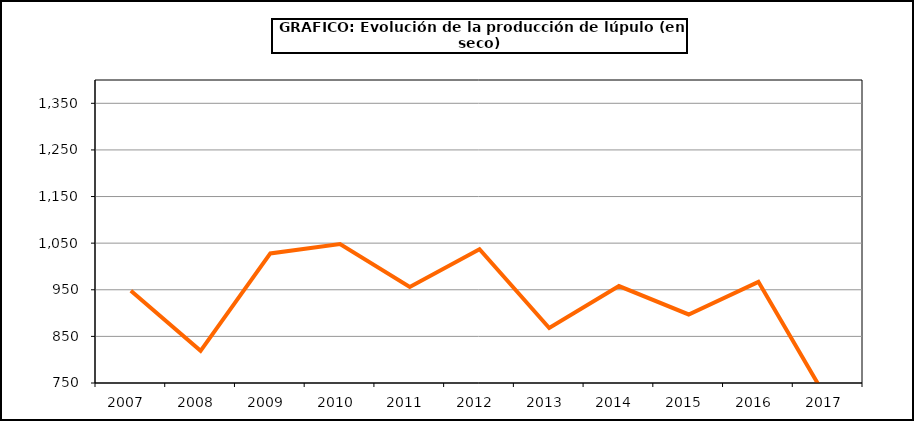
| Category | Superficie |
|---|---|
| 2007.0 | 948 |
| 2008.0 | 819 |
| 2009.0 | 1028 |
| 2010.0 | 1048 |
| 2011.0 | 956 |
| 2012.0 | 1037 |
| 2013.0 | 868 |
| 2014.0 | 958 |
| 2015.0 | 897 |
| 2016.0 | 967 |
| 2017.0 | 711 |